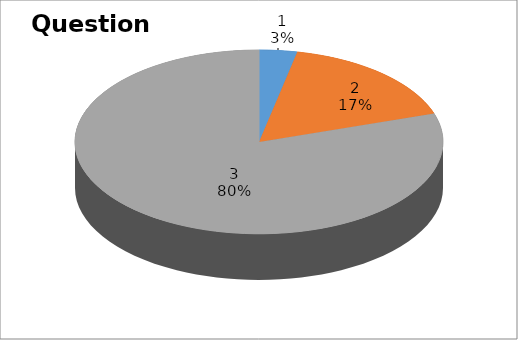
| Category | Series 0 |
|---|---|
| 0 | 2 |
| 1 | 10 |
| 2 | 48 |